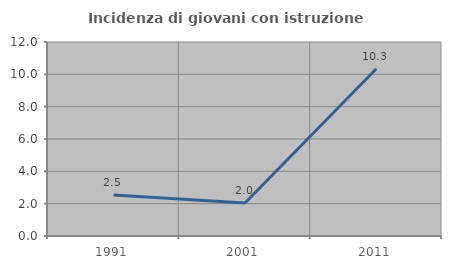
| Category | Incidenza di giovani con istruzione universitaria |
|---|---|
| 1991.0 | 2.532 |
| 2001.0 | 2.041 |
| 2011.0 | 10.345 |